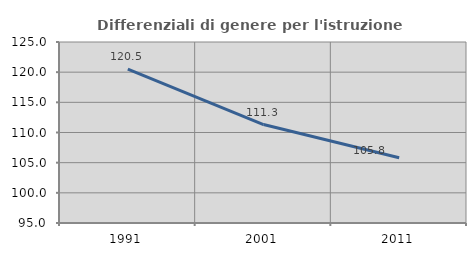
| Category | Differenziali di genere per l'istruzione superiore |
|---|---|
| 1991.0 | 120.522 |
| 2001.0 | 111.314 |
| 2011.0 | 105.826 |